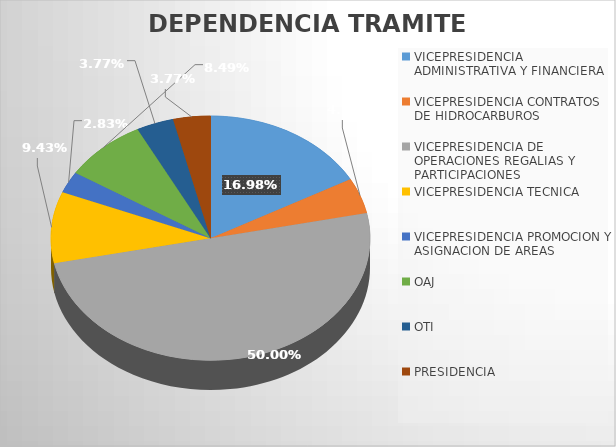
| Category | CANTIDAD |
|---|---|
| VICEPRESIDENCIA ADMINISTRATIVA Y FINANCIERA | 18 |
| VICEPRESIDENCIA CONTRATOS DE HIDROCARBUROS | 5 |
| VICEPRESIDENCIA DE OPERACIONES REGALIAS Y PARTICIPACIONES | 53 |
| VICEPRESIDENCIA TECNICA | 10 |
| VICEPRESIDENCIA PROMOCION Y ASIGNACION DE AREAS | 3 |
| OAJ | 9 |
| OTI | 4 |
| PRESIDENCIA  | 4 |